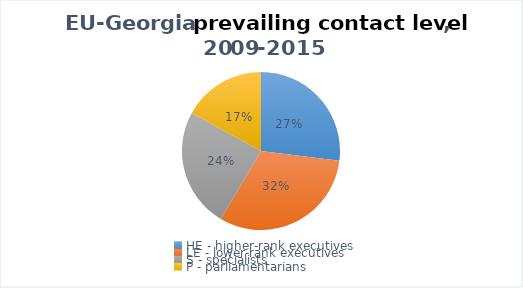
| Category | 2009-2015 |
|---|---|
| HE - higher-rank executives | 65 |
| LE - lower-rank executives | 76 |
| S - specialists | 59 |
| P - parliamentarians | 41 |